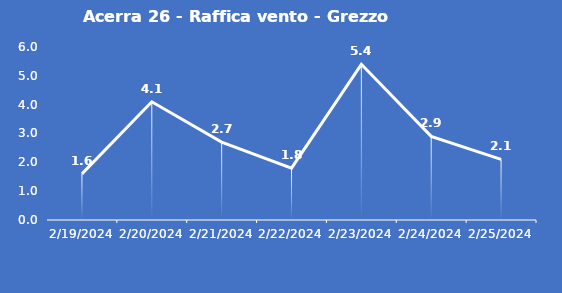
| Category | Acerra 26 - Raffica vento - Grezzo (m/s) |
|---|---|
| 2/19/24 | 1.6 |
| 2/20/24 | 4.1 |
| 2/21/24 | 2.7 |
| 2/22/24 | 1.8 |
| 2/23/24 | 5.4 |
| 2/24/24 | 2.9 |
| 2/25/24 | 2.1 |